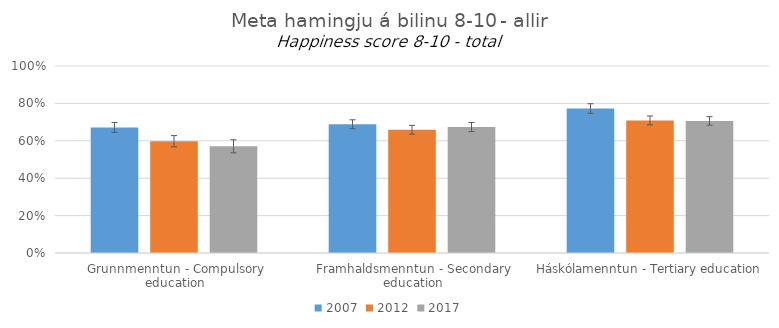
| Category | 2007 | 2012 | 2017 |
|---|---|---|---|
| Grunnmenntun - Compulsory education | 0.672 | 0.598 | 0.57 |
| Framhaldsmenntun - Secondary education | 0.689 | 0.659 | 0.673 |
| Háskólamenntun - Tertiary education | 0.773 | 0.709 | 0.706 |